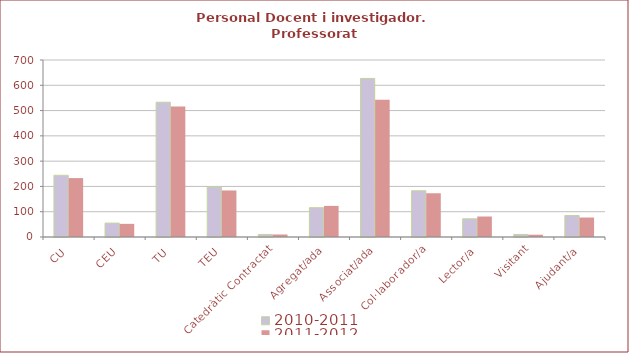
| Category | 2010-2011 | 2011-2012 |
|---|---|---|
| CU | 244 | 233 |
| CEU | 55 | 52 |
| TU | 533 | 516 |
| TEU | 198 | 184 |
| Catedràtic Contractat | 10 | 10 |
| Agregat/ada | 116 | 123 |
| Associat/ada | 627 | 543 |
| Col·laborador/a | 183 | 173 |
| Lector/a | 72 | 81 |
| Visitant | 10 | 9 |
| Ajudant/a | 85 | 77 |